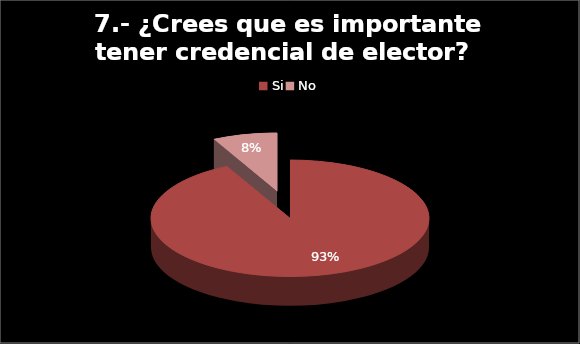
| Category | Series 0 |
|---|---|
| Si | 74 |
| No | 6 |